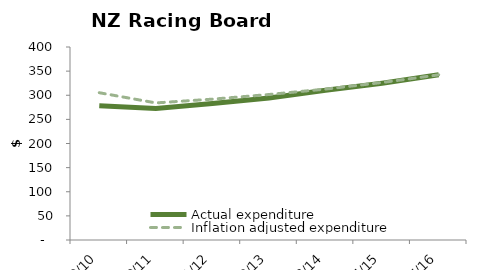
| Category | Actual expenditure | Inflation adjusted expenditure |
|---|---|---|
| 2009/10 | 278.393 | 305.244 |
| 2010/11 | 272.793 | 284.11 |
| 2011/12 | 282.951 | 291.914 |
| 2012/13 | 294.285 | 301.542 |
| 2013/14 | 310.171 | 312.767 |
| 2014/15 | 325.051 | 326.405 |
| 2015/16 | 342.291 | 342.291 |